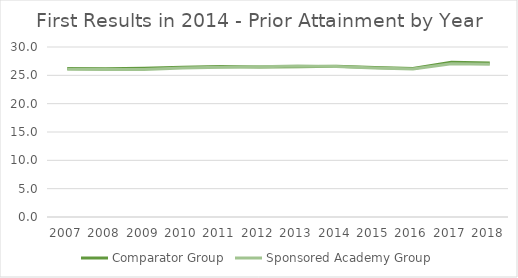
| Category | Comparator Group | Sponsored Academy Group |
|---|---|---|
| 2007.0 | 26.185 | 26.088 |
| 2008.0 | 26.148 | 26.012 |
| 2009.0 | 26.238 | 26.016 |
| 2010.0 | 26.429 | 26.315 |
| 2011.0 | 26.54 | 26.433 |
| 2012.0 | 26.482 | 26.493 |
| 2013.0 | 26.498 | 26.633 |
| 2014.0 | 26.62 | 26.564 |
| 2015.0 | 26.399 | 26.277 |
| 2016.0 | 26.218 | 26.1 |
| 2017.0 | 27.326 | 27.026 |
| 2018.0 | 27.193 | 26.96 |